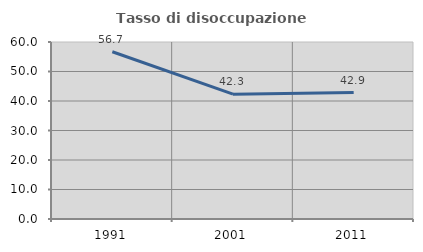
| Category | Tasso di disoccupazione giovanile  |
|---|---|
| 1991.0 | 56.688 |
| 2001.0 | 42.308 |
| 2011.0 | 42.857 |